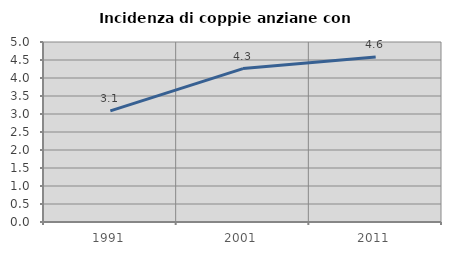
| Category | Incidenza di coppie anziane con figli |
|---|---|
| 1991.0 | 3.088 |
| 2001.0 | 4.261 |
| 2011.0 | 4.583 |